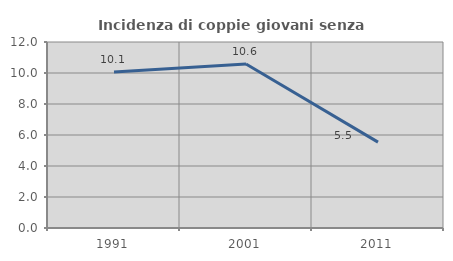
| Category | Incidenza di coppie giovani senza figli |
|---|---|
| 1991.0 | 10.064 |
| 2001.0 | 10.577 |
| 2011.0 | 5.543 |